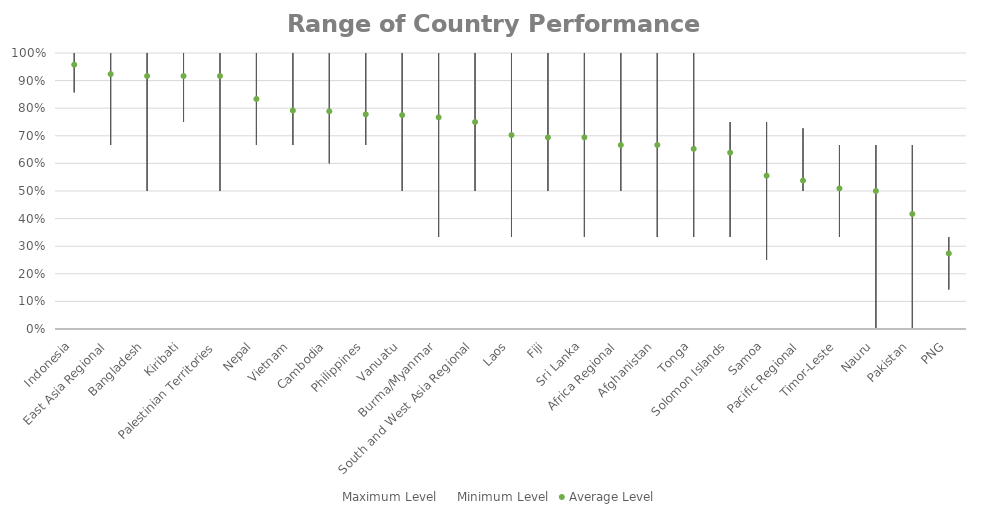
| Category | Maximum Level | Minimum Level | Average Level |
|---|---|---|---|
| Indonesia | 1 | 0.857 | 0.958 |
| East Asia Regional | 1 | 0.667 | 0.924 |
| Bangladesh | 1 | 0.5 | 0.917 |
| Kiribati | 1 | 0.75 | 0.917 |
| Palestinian Territories | 1 | 0.5 | 0.917 |
| Nepal | 1 | 0.667 | 0.833 |
| Vietnam | 1 | 0.667 | 0.792 |
| Cambodia | 1 | 0.6 | 0.789 |
| Philippines | 1 | 0.667 | 0.778 |
| Vanuatu | 1 | 0.5 | 0.775 |
| Burma/Myanmar | 1 | 0.333 | 0.767 |
| South and West Asia Regional | 1 | 0.5 | 0.75 |
| Laos | 1 | 0.333 | 0.703 |
| Fiji | 1 | 0.5 | 0.694 |
| Sri Lanka | 1 | 0.333 | 0.694 |
| Africa Regional | 1 | 0.5 | 0.667 |
| Afghanistan | 1 | 0.333 | 0.667 |
| Tonga | 1 | 0.333 | 0.653 |
| Solomon Islands | 0.75 | 0.333 | 0.639 |
| Samoa | 0.75 | 0.25 | 0.556 |
| Pacific Regional | 0.727 | 0.5 | 0.538 |
| Timor-Leste | 0.667 | 0.333 | 0.509 |
| Nauru | 0.667 | 0 | 0.5 |
| Pakistan | 0.667 | 0 | 0.417 |
| PNG | 0.333 | 0.143 | 0.274 |